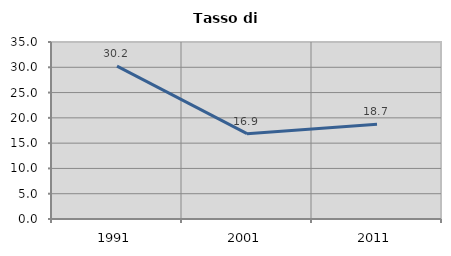
| Category | Tasso di disoccupazione   |
|---|---|
| 1991.0 | 30.225 |
| 2001.0 | 16.874 |
| 2011.0 | 18.716 |